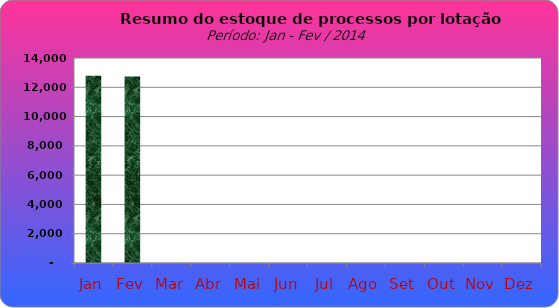
| Category | Series 0 |
|---|---|
| Jan | 12795 |
| Fev | 12744 |
| Mar | 0 |
| Abr | 0 |
| Mai | 0 |
| Jun | 0 |
| Jul | 0 |
| Ago | 0 |
| Set | 0 |
| Out | 0 |
| Nov | 0 |
| Dez | 0 |